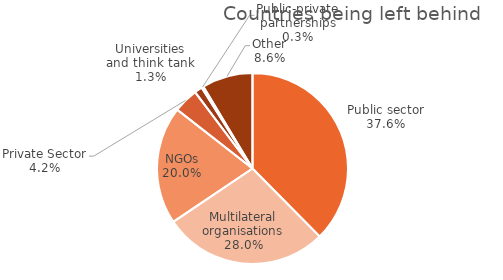
| Category | Series 0 |
|---|---|
| Public sector | 11838.65 |
| Multilateral organisations | 8812.462 |
| NGOs | 6293.677 |
| Private Sector | 1317.21 |
| Universities and think tank | 420.937 |
| Public-private partnerships | 100.74 |
| Other | 2711.741 |